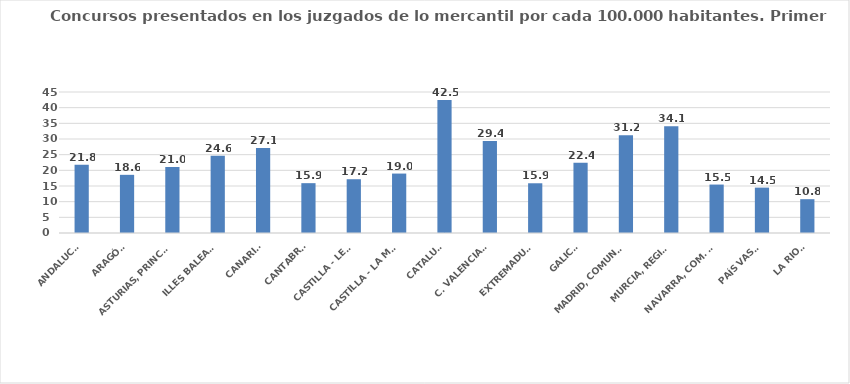
| Category | Series 0 |
|---|---|
| ANDALUCÍA | 21.819 |
| ARAGÓN | 18.562 |
| ASTURIAS, PRINCIPADO | 21.025 |
| ILLES BALEARS | 24.633 |
| CANARIAS | 27.135 |
| CANTABRIA | 15.905 |
| CASTILLA - LEÓN | 17.161 |
| CASTILLA - LA MANCHA | 18.968 |
| CATALUÑA | 42.466 |
| C. VALENCIANA | 29.354 |
| EXTREMADURA | 15.872 |
| GALICIA | 22.431 |
| MADRID, COMUNIDAD | 31.21 |
| MURCIA, REGIÓN | 34.086 |
| NAVARRA, COM. FORAL | 15.46 |
| PAÍS VASCO | 14.485 |
| LA RIOJA | 10.792 |